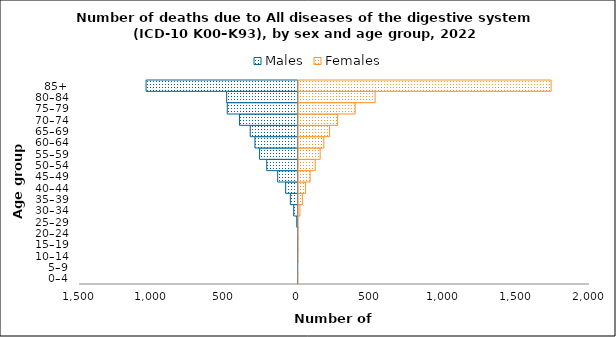
| Category | Males | Females |
|---|---|---|
| 0–4 | -4 | 1 |
| 5–9 | -1 | 0 |
| 10–14 | -2 | 1 |
| 15–19 | -2 | 3 |
| 20–24 | -2 | 3 |
| 25–29 | -9 | 2 |
| 30–34 | -30 | 16 |
| 35–39 | -53 | 33 |
| 40–44 | -85 | 55 |
| 45–49 | -140 | 86 |
| 50–54 | -215 | 121 |
| 55–59 | -264 | 155 |
| 60–64 | -296 | 180 |
| 65–69 | -328 | 220 |
| 70–74 | -402 | 275 |
| 75–79 | -486 | 395 |
| 80–84 | -490 | 532 |
| 85+ | -1043 | 1740 |